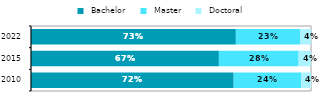
| Category |  Bachelor |  Master |  Doctoral |
|---|---|---|---|
| 2010.0 | 0.724 | 0.241 | 0.036 |
| 2015.0 | 0.671 | 0.285 | 0.044 |
| 2022.0 | 0.732 | 0.23 | 0.038 |